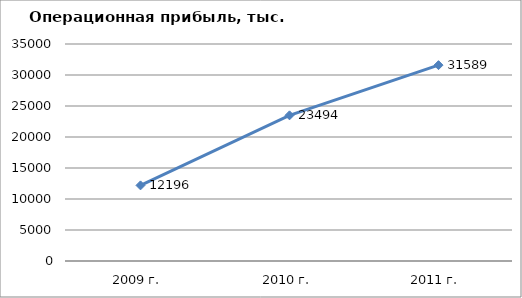
| Category | Series 0 |
|---|---|
| 2009 г. | 12196 |
| 2010 г. | 23494 |
| 2011 г. | 31589 |